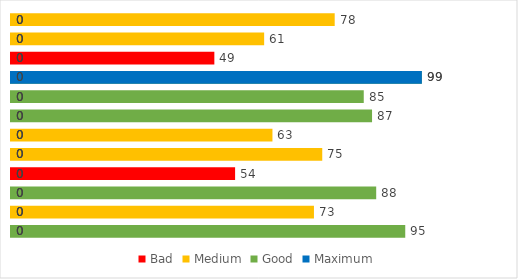
| Category | Bad | Medium | Good | Maximum |
|---|---|---|---|---|
| 0 | 0 | 0 | 95 | 0 |
| 1 | 0 | 73 | 0 | 0 |
| 2 | 0 | 0 | 88 | 0 |
| 3 | 54 | 0 | 0 | 0 |
| 4 | 0 | 75 | 0 | 0 |
| 5 | 0 | 63 | 0 | 0 |
| 6 | 0 | 0 | 87 | 0 |
| 7 | 0 | 0 | 85 | 0 |
| 8 | 0 | 0 | 99 | 99 |
| 9 | 49 | 0 | 0 | 0 |
| 10 | 0 | 61 | 0 | 0 |
| 11 | 0 | 78 | 0 | 0 |